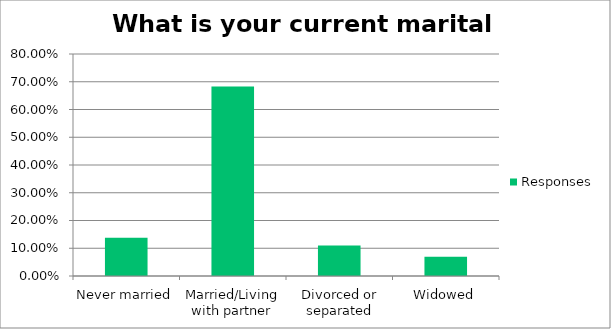
| Category | Responses |
|---|---|
| Never married | 0.138 |
| Married/Living with partner | 0.683 |
| Divorced or separated | 0.11 |
| Widowed | 0.069 |